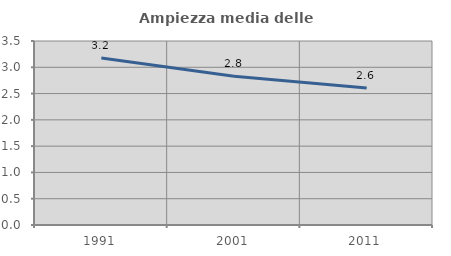
| Category | Ampiezza media delle famiglie |
|---|---|
| 1991.0 | 3.177 |
| 2001.0 | 2.83 |
| 2011.0 | 2.606 |